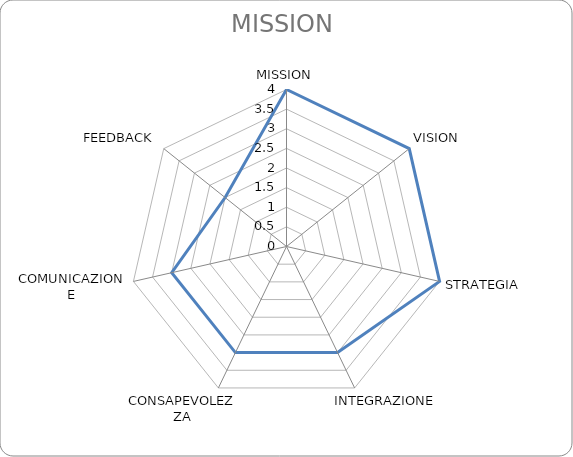
| Category | Series 0 |
|---|---|
| MISSION | 4 |
| VISION | 4 |
| STRATEGIA | 4 |
| INTEGRAZIONE | 3 |
| CONSAPEVOLEZZA | 3 |
| COMUNICAZIONE | 3 |
| FEEDBACK | 2 |